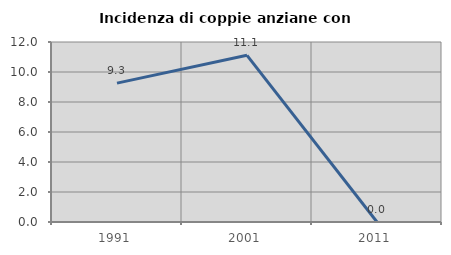
| Category | Incidenza di coppie anziane con figli |
|---|---|
| 1991.0 | 9.259 |
| 2001.0 | 11.111 |
| 2011.0 | 0 |